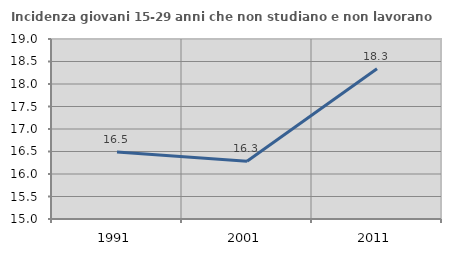
| Category | Incidenza giovani 15-29 anni che non studiano e non lavorano  |
|---|---|
| 1991.0 | 16.488 |
| 2001.0 | 16.282 |
| 2011.0 | 18.339 |